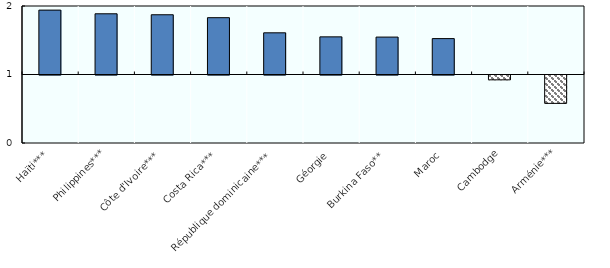
| Category | Series 0 |
|---|---|
| Haïti*** | 1.94 |
| Philippines*** | 1.886 |
| Côte d'Ivoire*** | 1.872 |
| Costa Rica*** | 1.829 |
| République dominicaine*** | 1.608 |
| Géorgie | 1.55 |
| Burkina Faso** | 1.546 |
| Maroc | 1.524 |
| Cambodge | 0.929 |
| Arménie*** | 0.586 |